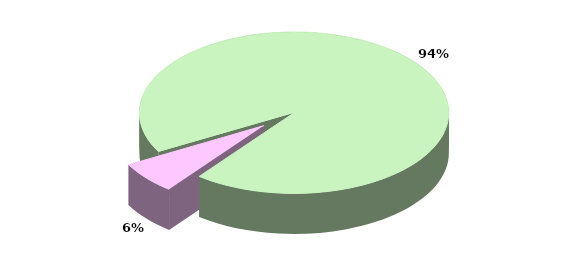
| Category | Series 0 |
|---|---|
| TOTALE ENTRATE CORRENTI | 23138.845 |
| TOTALE ENTRATE IN CONTO CAPITALE | 1590.515 |